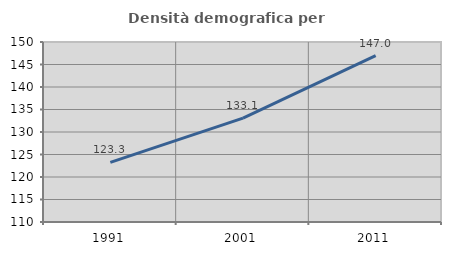
| Category | Densità demografica |
|---|---|
| 1991.0 | 123.252 |
| 2001.0 | 133.07 |
| 2011.0 | 146.968 |